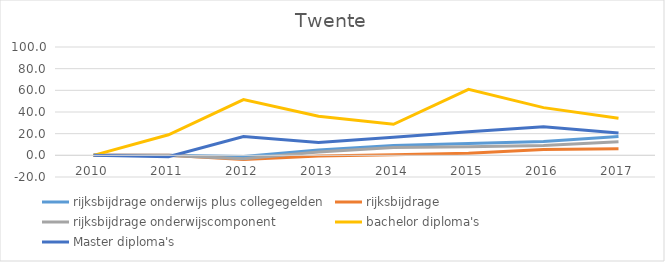
| Category | rijksbijdrage onderwijs plus collegegelden | rijksbijdrage  | rijksbijdrage onderwijscomponent | bachelor diploma's | Master diploma's |
|---|---|---|---|---|---|
| 2010.0 | 0 | 0 | 0 | 0 | 0 |
| 2011.0 | 0.172 | 0.053 | -0.264 | 18.952 | -1.359 |
| 2012.0 | -0.987 | -3.952 | -3.06 | 51.394 | 17.379 |
| 2013.0 | 4.89 | -0.632 | 3.037 | 36.12 | 11.748 |
| 2014.0 | 8.988 | 0.527 | 7.121 | 28.651 | 16.602 |
| 2015.0 | 11.02 | 1.949 | 7.91 | 60.87 | 21.748 |
| 2016.0 | 12.709 | 5.427 | 8.993 | 44.036 | 26.311 |
| 2017.0 | 17.495 | 6.059 | 12.493 | 34.225 | 20.68 |